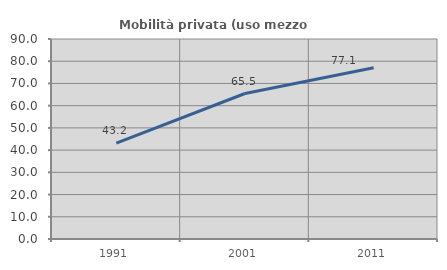
| Category | Mobilità privata (uso mezzo privato) |
|---|---|
| 1991.0 | 43.157 |
| 2001.0 | 65.47 |
| 2011.0 | 77.093 |